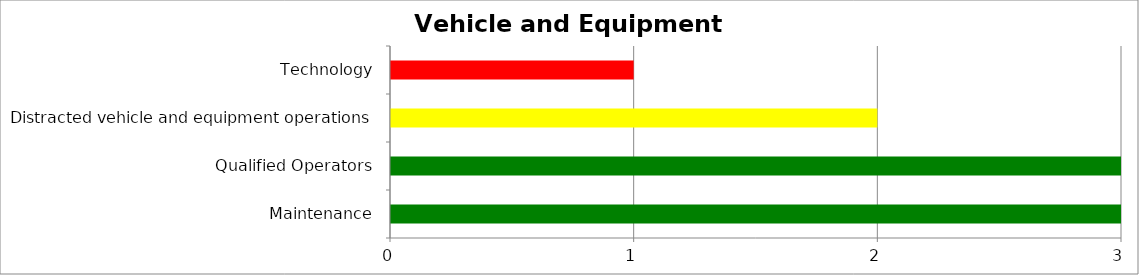
| Category | Low | Medium | High |
|---|---|---|---|
| Maintenance | 3 | 0 | 0 |
| Qualified Operators | 3 | 0 | 0 |
| Distracted vehicle and equipment operations | 0 | 2 | 0 |
| Technology | 0 | 0 | 1 |